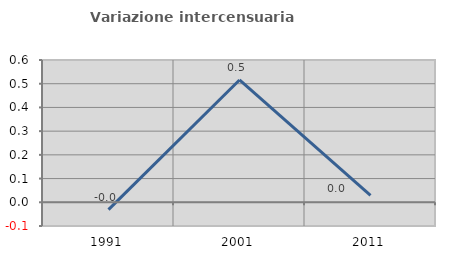
| Category | Variazione intercensuaria annua |
|---|---|
| 1991.0 | -0.031 |
| 2001.0 | 0.516 |
| 2011.0 | 0.029 |